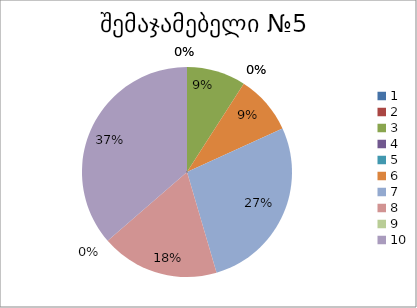
| Category | რაოდენობა | ქულა |
|---|---|---|
| 0 | 0 | 1 |
| 1 | 0 | 2 |
| 2 | 1 | 3 |
| 3 | 0 | 4 |
| 4 | 0 | 5 |
| 5 | 1 | 6 |
| 6 | 3 | 7 |
| 7 | 2 | 8 |
| 8 | 0 | 9 |
| 9 | 4 | 10 |